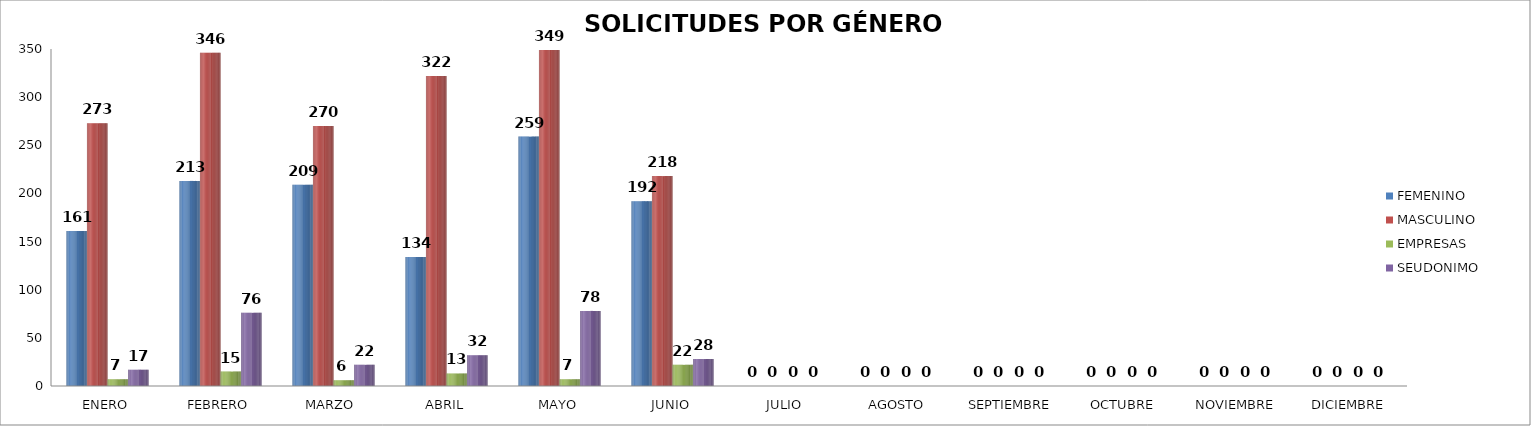
| Category | FEMENINO | MASCULINO | EMPRESAS | SEUDONIMO |
|---|---|---|---|---|
| ENERO | 161 | 273 | 7 | 17 |
| FEBRERO | 213 | 346 | 15 | 76 |
| MARZO  | 209 | 270 | 6 | 22 |
| ABRIL | 134 | 322 | 13 | 32 |
| MAYO | 259 | 349 | 7 | 78 |
| JUNIO | 192 | 218 | 22 | 28 |
| JULIO | 0 | 0 | 0 | 0 |
| AGOSTO | 0 | 0 | 0 | 0 |
| SEPTIEMBRE | 0 | 0 | 0 | 0 |
| OCTUBRE | 0 | 0 | 0 | 0 |
| NOVIEMBRE | 0 | 0 | 0 | 0 |
| DICIEMBRE | 0 | 0 | 0 | 0 |